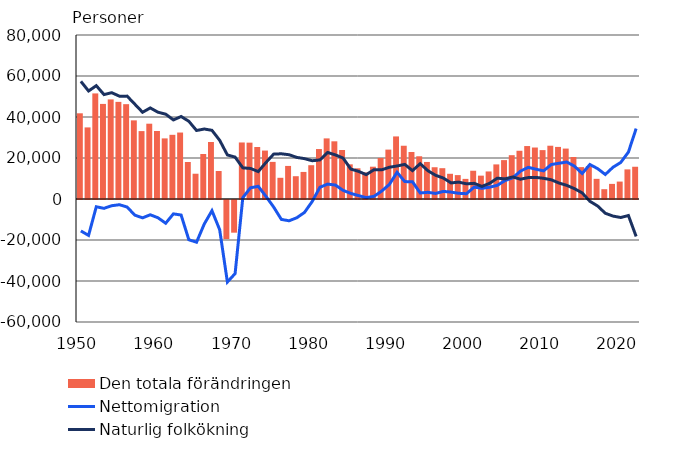
| Category | Den totala förändringen |
|---|---|
| 1950.0 | 41807 |
| 1951.0 | 34924 |
| 1952.0 | 51501 |
| 1953.0 | 46381 |
| 1954.0 | 48582 |
| 1955.0 | 47380 |
| 1956.0 | 46261 |
| 1957.0 | 38358 |
| 1958.0 | 33124 |
| 1959.0 | 36732 |
| 1960.0 | 33176 |
| 1961.0 | 29565 |
| 1962.0 | 31311 |
| 1963.0 | 32421 |
| 1964.0 | 18048 |
| 1965.0 | 12329 |
| 1966.0 | 21946 |
| 1967.0 | 27803 |
| 1968.0 | 13647 |
| 1969.0 | -19015 |
| 1970.0 | -15941 |
| 1971.0 | 27576 |
| 1972.0 | 27489 |
| 1973.0 | 25360 |
| 1974.0 | 23626 |
| 1975.0 | 18105 |
| 1976.0 | 10344 |
| 1977.0 | 16131 |
| 1978.0 | 11121 |
| 1979.0 | 13204 |
| 1980.0 | 16486 |
| 1981.0 | 24372 |
| 1982.0 | 29565 |
| 1983.0 | 28143 |
| 1984.0 | 23890 |
| 1985.0 | 16916 |
| 1986.0 | 14980 |
| 1987.0 | 12958 |
| 1988.0 | 15757 |
| 1989.0 | 20024 |
| 1990.0 | 24095 |
| 1991.0 | 30524 |
| 1992.0 | 25980 |
| 1993.0 | 22930 |
| 1994.0 | 20842 |
| 1995.0 | 18072 |
| 1996.0 | 15494 |
| 1997.0 | 15029 |
| 1998.0 | 12297 |
| 1999.0 | 11656 |
| 2000.0 | 9813 |
| 2001.0 | 13786 |
| 2002.0 | 11394 |
| 2003.0 | 13437 |
| 2004.0 | 16879 |
| 2005.0 | 18969 |
| 2006.0 | 21375 |
| 2007.0 | 23529 |
| 2008.0 | 25830 |
| 2009.0 | 25113 |
| 2010.0 | 23849 |
| 2011.0 | 25991 |
| 2012.0 | 25407 |
| 2013.0 | 24596 |
| 2014.0 | 20483 |
| 2015.0 | 15555 |
| 2016.0 | 15989 |
| 2017.0 | 9833 |
| 2018.0 | 4789 |
| 2019.0 | 7373 |
| 2020.0 | 8501 |
| 2021.0 | 14448 |
| 2022.0 | 15729 |